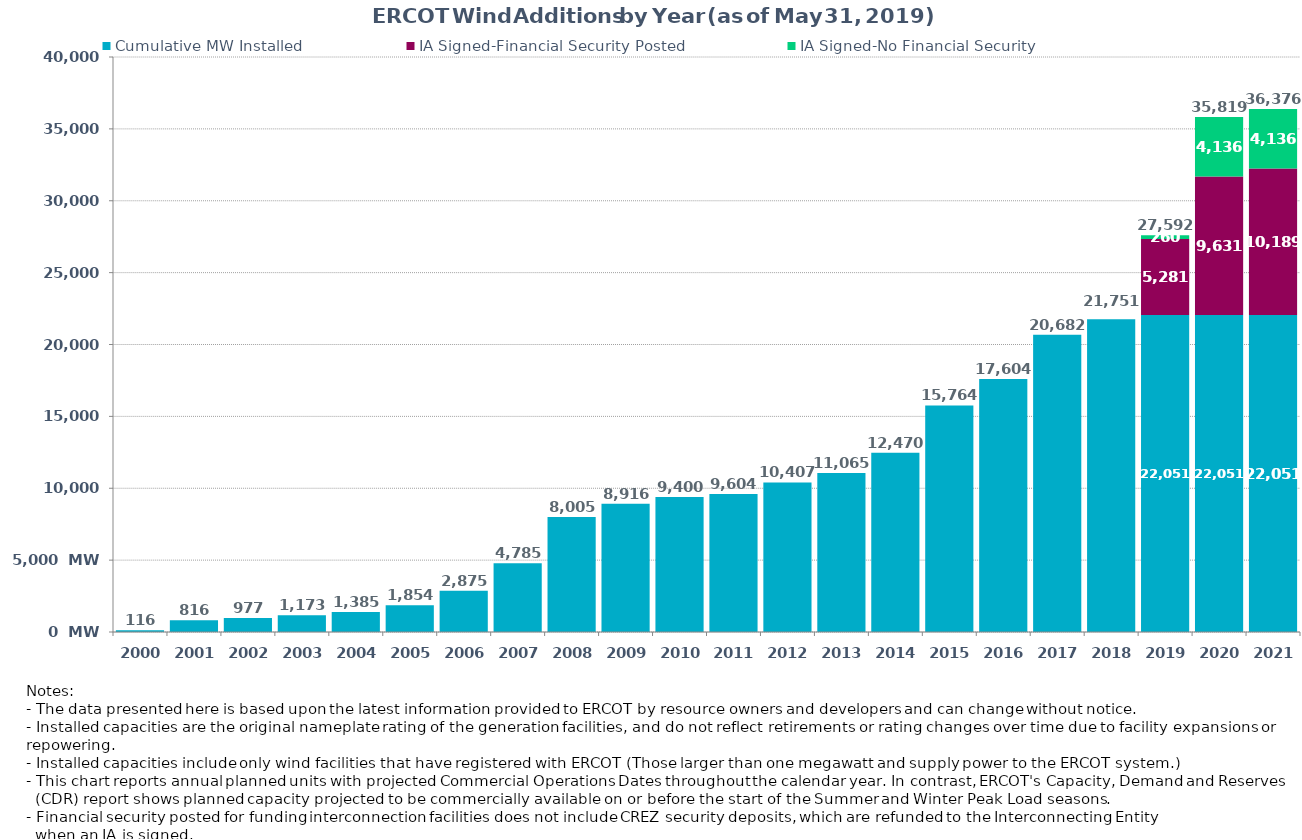
| Category | Cumulative MW Installed | IA Signed-Financial Security Posted  | IA Signed-No Financial Security  | Cumulative Installed and Planned |
|---|---|---|---|---|
| 2000.0 | 116 | 0 | 0 | 116 |
| 2001.0 | 816 | 0 | 0 | 816 |
| 2002.0 | 977 | 0 | 0 | 977 |
| 2003.0 | 1173 | 0 | 0 | 1173 |
| 2004.0 | 1385 | 0 | 0 | 1385 |
| 2005.0 | 1854 | 0 | 0 | 1854 |
| 2006.0 | 2875 | 0 | 0 | 2875 |
| 2007.0 | 4785 | 0 | 0 | 4785 |
| 2008.0 | 8005 | 0 | 0 | 8005 |
| 2009.0 | 8916 | 0 | 0 | 8916 |
| 2010.0 | 9400 | 0 | 0 | 9400 |
| 2011.0 | 9604 | 0 | 0 | 9604 |
| 2012.0 | 10407 | 0 | 0 | 10407 |
| 2013.0 | 11065 | 0 | 0 | 11065 |
| 2014.0 | 12470 | 0 | 0 | 12470 |
| 2015.0 | 15764 | 0 | 0 | 15764 |
| 2016.0 | 17604 | 0 | 0 | 17604 |
| 2017.0 | 20682 | 0 | 0 | 20682 |
| 2018.0 | 21751 | 0 | 0 | 21751 |
| 2019.0 | 22051 | 5280.68 | 260.4 | 27592.08 |
| 2020.0 | 22051 | 9631.49 | 4136.1 | 35818.59 |
| 2021.0 | 22051 | 10189.29 | 4136.1 | 36376.39 |